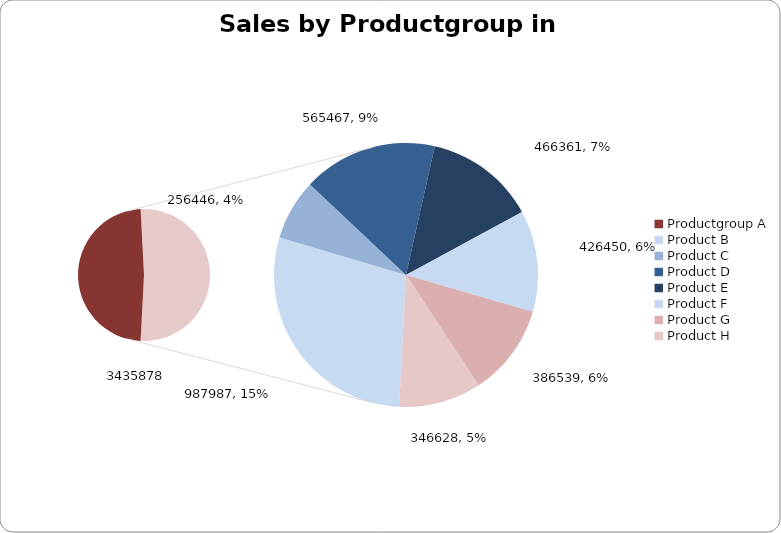
| Category | Sales 2008 |
|---|---|
| Productgroup A | 3216546 |
| Product B | 987987 |
| Product C | 256446 |
| Product D | 565467 |
| Product E | 466361 |
| Product F | 426450 |
| Product G | 386539 |
| Product H | 346628 |